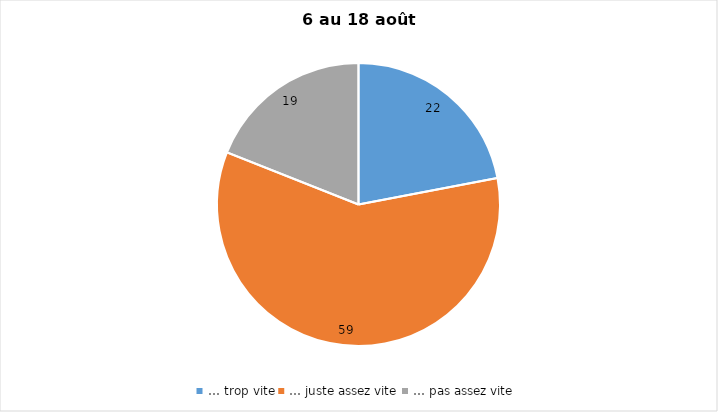
| Category | Series 0 |
|---|---|
| … trop vite | 22 |
| … juste assez vite | 59 |
| … pas assez vite | 19 |